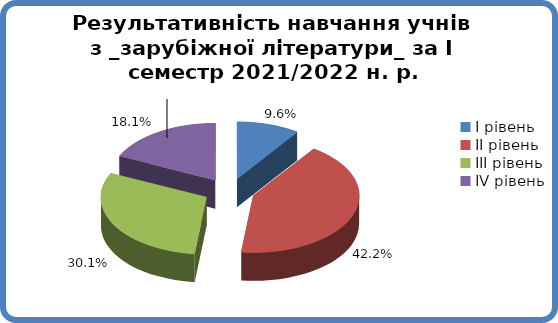
| Category | Series 0 |
|---|---|
| 0 | 0.096 |
| 1 | 0.422 |
| 2 | 0.301 |
| 3 | 0.181 |